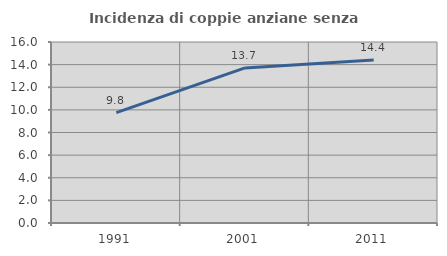
| Category | Incidenza di coppie anziane senza figli  |
|---|---|
| 1991.0 | 9.756 |
| 2001.0 | 13.71 |
| 2011.0 | 14.414 |